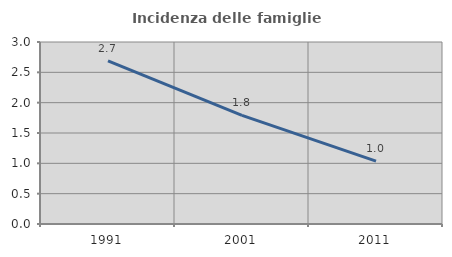
| Category | Incidenza delle famiglie numerose |
|---|---|
| 1991.0 | 2.688 |
| 2001.0 | 1.791 |
| 2011.0 | 1.036 |